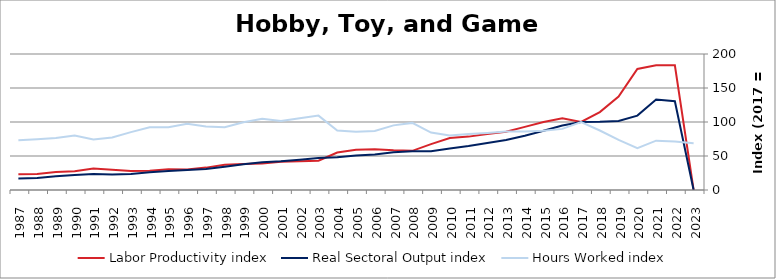
| Category | Labor Productivity index | Real Sectoral Output index | Hours Worked index |
|---|---|---|---|
| 2023.0 | 0 | 0 | 68.748 |
| 2022.0 | 183.346 | 130.506 | 71.18 |
| 2021.0 | 183.344 | 132.945 | 72.511 |
| 2020.0 | 178.068 | 109.364 | 61.417 |
| 2019.0 | 137.326 | 101.383 | 73.827 |
| 2018.0 | 114.615 | 100.301 | 87.511 |
| 2017.0 | 100 | 100 | 100 |
| 2016.0 | 105.502 | 94.84 | 89.894 |
| 2015.0 | 100.012 | 87.053 | 87.043 |
| 2014.0 | 92.794 | 79.895 | 86.099 |
| 2013.0 | 85.664 | 73.58 | 85.894 |
| 2012.0 | 82.497 | 69.191 | 83.871 |
| 2011.0 | 78.507 | 64.584 | 82.265 |
| 2010.0 | 76.323 | 61.151 | 80.122 |
| 2009.0 | 67.42 | 56.933 | 84.444 |
| 2008.0 | 57.57 | 56.817 | 98.691 |
| 2007.0 | 58.378 | 55.493 | 95.057 |
| 2006.0 | 60.106 | 52.195 | 86.837 |
| 2005.0 | 59.103 | 50.72 | 85.816 |
| 2004.0 | 55.108 | 48.25 | 87.556 |
| 2003.0 | 43.03 | 47.061 | 109.367 |
| 2002.0 | 42.298 | 44.638 | 105.533 |
| 2001.0 | 41.688 | 42.248 | 101.344 |
| 2000.0 | 38.946 | 40.816 | 104.8 |
| 1999.0 | 38.17 | 38.023 | 99.614 |
| 1998.0 | 37.126 | 34.23 | 92.2 |
| 1997.0 | 32.917 | 30.76 | 93.447 |
| 1996.0 | 30.243 | 29.434 | 97.324 |
| 1995.0 | 30.356 | 28.067 | 92.46 |
| 1994.0 | 28.133 | 25.946 | 92.228 |
| 1993.0 | 27.813 | 23.68 | 85.14 |
| 1992.0 | 29.729 | 22.978 | 77.292 |
| 1991.0 | 31.713 | 23.574 | 74.336 |
| 1990.0 | 27.443 | 21.993 | 80.138 |
| 1989.0 | 26.362 | 20.194 | 76.603 |
| 1988.0 | 23.636 | 17.676 | 74.784 |
| 1987.0 | 23.006 | 16.836 | 73.18 |